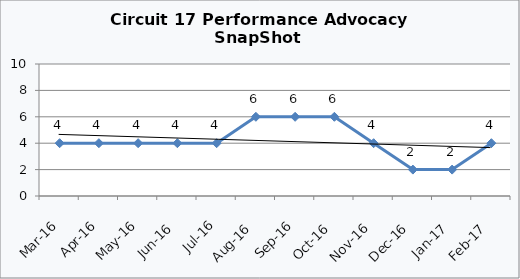
| Category | Circuit 17 |
|---|---|
| Mar-16 | 4 |
| Apr-16 | 4 |
| May-16 | 4 |
| Jun-16 | 4 |
| Jul-16 | 4 |
| Aug-16 | 6 |
| Sep-16 | 6 |
| Oct-16 | 6 |
| Nov-16 | 4 |
| Dec-16 | 2 |
| Jan-17 | 2 |
| Feb-17 | 4 |